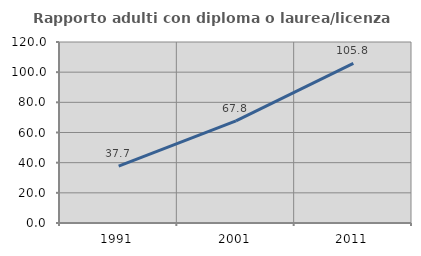
| Category | Rapporto adulti con diploma o laurea/licenza media  |
|---|---|
| 1991.0 | 37.674 |
| 2001.0 | 67.769 |
| 2011.0 | 105.769 |